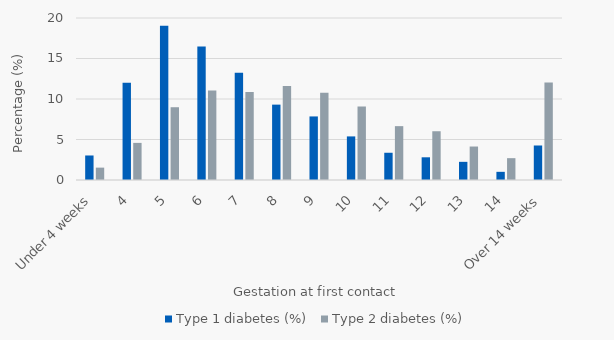
| Category | Type 1 diabetes (%) | Type 2 diabetes (%) |
|---|---|---|
| Under 4 weeks | 3.027 | 1.527 |
| 4 | 11.996 | 4.582 |
| 5 | 19.058 | 8.985 |
| 6 | 16.48 | 11.051 |
| 7 | 13.229 | 10.872 |
| 8 | 9.305 | 11.59 |
| 9 | 7.848 | 10.782 |
| 10 | 5.381 | 9.075 |
| 11 | 3.363 | 6.649 |
| 12 | 2.803 | 6.02 |
| 13 | 2.242 | 4.133 |
| 14 | 1.009 | 2.695 |
| Over 14 weeks | 4.26 | 12.04 |